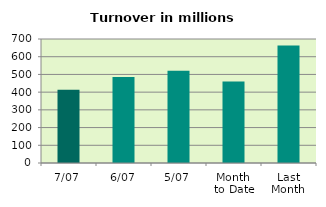
| Category | Series 0 |
|---|---|
| 7/07 | 413.42 |
| 6/07 | 485.727 |
| 5/07 | 520.46 |
| Month 
to Date | 459.694 |
| Last
Month | 663.186 |